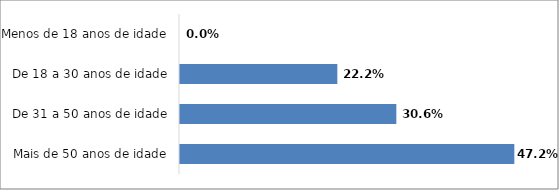
| Category | Series 0 |
|---|---|
| Mais de 50 anos de idade | 0.472 |
| De 31 a 50 anos de idade | 0.306 |
| De 18 a 30 anos de idade | 0.222 |
| Menos de 18 anos de idade | 0 |